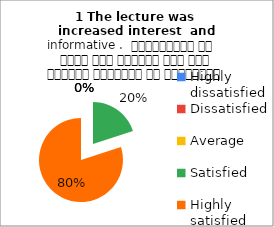
| Category | 1 The lecture was  increased interest  and informative .  व्याख्यान से रुचि में वृद्धि हुई एवं शिक्षण जानकारी से परिपूर्ण था |
|---|---|
| Highly dissatisfied | 0 |
| Dissatisfied | 0 |
| Average | 0 |
| Satisfied | 7 |
| Highly satisfied | 28 |